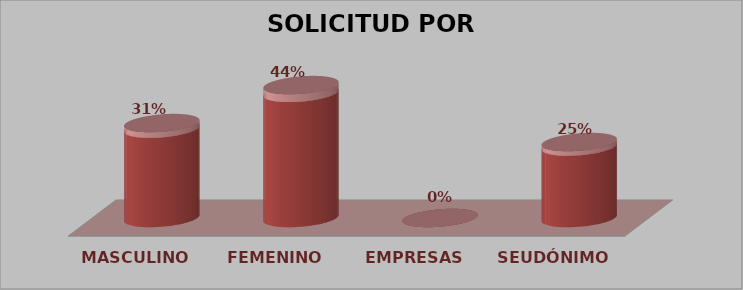
| Category | SOLICITUD POR SEXO | Series 1 |
|---|---|---|
| MASCULINO | 5 | 0.312 |
| FEMENINO | 7 | 0.438 |
| EMPRESAS | 0 | 0 |
| SEUDÓNIMO | 4 | 0.25 |